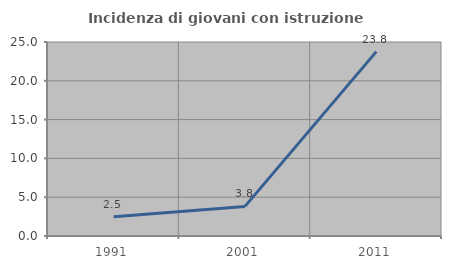
| Category | Incidenza di giovani con istruzione universitaria |
|---|---|
| 1991.0 | 2.491 |
| 2001.0 | 3.817 |
| 2011.0 | 23.762 |